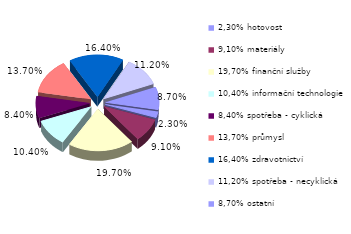
| Category | Series 0 |
|---|---|
| 2,30% hotovost | 0.023 |
| 9,10% materiály | 0.091 |
| 19,70% finanční služby | 0.197 |
| 10,40% informační technologie | 0.104 |
| 8,40% spotřeba - cyklická | 0.084 |
| 13,70% průmysl | 0.137 |
| 16,40% zdravotnictví | 0.164 |
| 11,20% spotřeba - necyklická | 0.112 |
| 8,70% ostatní | 0.087 |